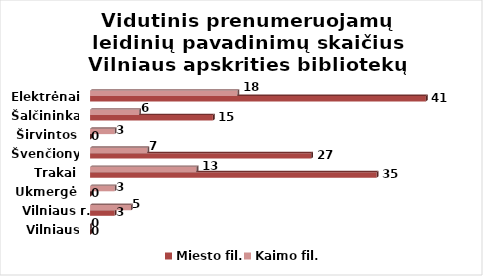
| Category | Miesto fil. | Kaimo fil. |
|---|---|---|
| Vilniaus m. | 0 | 0 |
| Vilniaus r. | 3 | 5 |
| Ukmergė | 0 | 3 |
| Trakai | 35 | 13 |
| Švenčionys | 27 | 7 |
| Širvintos | 0 | 3 |
| Šalčininkai | 15 | 6 |
| Elektrėnai | 41 | 18 |